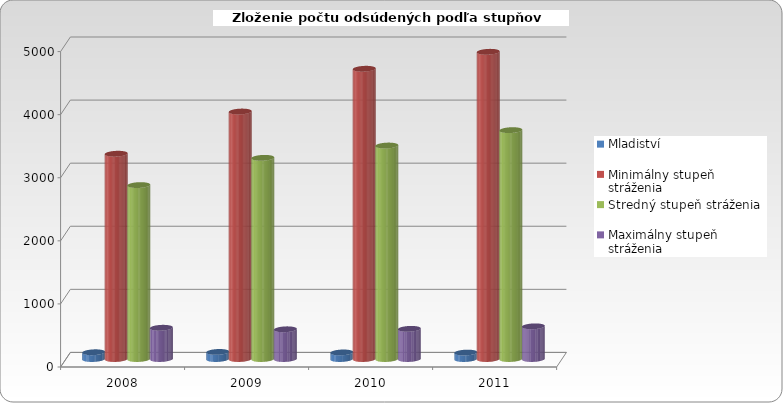
| Category | Mladiství | Minimálny stupeň stráženia | Stredný stupeň stráženia | Maximálny stupeň stráženia |
|---|---|---|---|---|
| 2008.0 | 107 | 3254 | 2757 | 495 |
| 2009.0 | 112 | 3923 | 3189 | 471 |
| 2010.0 | 104 | 4601 | 3384 | 478 |
| 2011.0 | 102 | 4870 | 3628 | 518 |